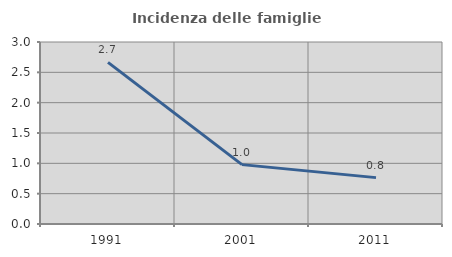
| Category | Incidenza delle famiglie numerose |
|---|---|
| 1991.0 | 2.664 |
| 2001.0 | 0.979 |
| 2011.0 | 0.765 |